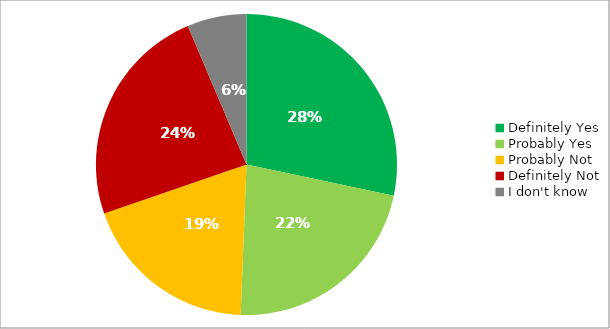
| Category | Responses |
|---|---|
| Definitely Yes | 0.283 |
| Probably Yes | 0.223 |
| Probably Not | 0.191 |
| Definitely Not | 0.239 |
| I don't know | 0.064 |